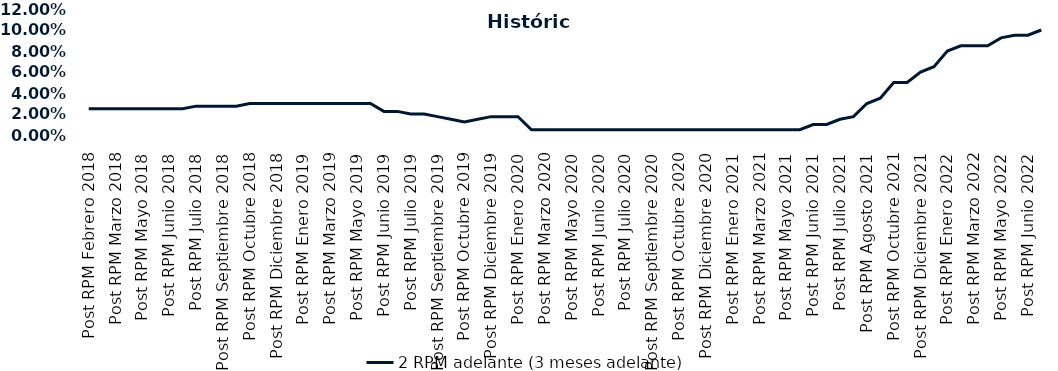
| Category | 2 RPM adelante (3 meses adelante) |
|---|---|
| Post RPM Febrero 2018 | 0.025 |
| Pre RPM Marzo 2018 | 0.025 |
| Post RPM Marzo 2018 | 0.025 |
| Pre RPM Mayo 2018 | 0.025 |
| Post RPM Mayo 2018 | 0.025 |
| Pre RPM Junio 2018 | 0.025 |
| Post RPM Junio 2018 | 0.025 |
| Pre RPM Julio 2018 | 0.025 |
| Post RPM Julio 2018 | 0.028 |
| Pre RPM Septiembre 2018 | 0.028 |
| Post RPM Septiembre 2018 | 0.028 |
| Pre RPM Octubre 2018 | 0.028 |
| Post RPM Octubre 2018 | 0.03 |
| Pre RPM Diciembre 2018 | 0.03 |
| Post RPM Diciembre 2018 | 0.03 |
| Pre RPM Enero 2019 | 0.03 |
| Post RPM Enero 2019 | 0.03 |
| Pre RPM Marzo 2019 | 0.03 |
| Post RPM Marzo 2019 | 0.03 |
| Pre RPM Mayo 2019 | 0.03 |
| Post RPM Mayo 2019 | 0.03 |
| Pre RPM Junio 2019 | 0.03 |
| Post RPM Junio 2019 | 0.022 |
| Pre RPM Julio 2019 | 0.022 |
| Post RPM Julio 2019 | 0.02 |
| Pre RPM Septiembre 2019 | 0.02 |
| Post RPM Septiembre 2019 | 0.018 |
| Pre RPM Octubre 2019 | 0.015 |
| Post RPM Octubre 2019 | 0.012 |
| Pre RPM Diciembre 2019 | 0.015 |
| Post RPM Diciembre 2019 | 0.018 |
| Pre RPM Enero 2020 | 0.018 |
| Post RPM Enero 2020 | 0.018 |
| Pre RPM Marzo 2020 | 0.005 |
| Post RPM Marzo 2020 | 0.005 |
| Pre RPM Mayo 2020 | 0.005 |
| Post RPM Mayo 2020 | 0.005 |
| Pre RPM Junio 2020 | 0.005 |
| Post RPM Junio 2020 | 0.005 |
| Pre RPM Julio 2020 | 0.005 |
| Post RPM Julio 2020 | 0.005 |
| Pre RPM Septiembre 2020 | 0.005 |
| Post RPM Septiembre 2020 | 0.005 |
| Pre RPM Octubre 2020 | 0.005 |
| Post RPM Octubre 2020 | 0.005 |
| Pre RPM Diciembre 2020 | 0.005 |
| Post RPM Diciembre 2020 | 0.005 |
| Pre RPM Enero 2021 | 0.005 |
| Post RPM Enero 2021 | 0.005 |
| Pre RPM Marzo 2021 | 0.005 |
| Post RPM Marzo 2021 | 0.005 |
| Pre RPM Mayo 2021 | 0.005 |
| Post RPM Mayo 2021 | 0.005 |
| Pre RPM Junio 2021 | 0.005 |
| Post RPM Junio 2021 | 0.01 |
| Pre RPM Julio 2021 | 0.01 |
| Post RPM Julio 2021 | 0.015 |
| Pre RPM Agosto 2021 | 0.018 |
| Post RPM Agosto 2021 | 0.03 |
| Pre RPM Octubre 2021 | 0.035 |
| Post RPM Octubre 2021 | 0.05 |
| Pre RPM Diciembre 2021 | 0.05 |
| Post RPM Diciembre 2021 | 0.06 |
| Pre RPM Enero 2022 | 0.065 |
| Post RPM Enero 2022 | 0.08 |
| Pre RPM Marzo 2022 | 0.085 |
| Post RPM Marzo 2022 | 0.085 |
| Pre RPM Mayo 2022 | 0.085 |
| Post RPM Mayo 2022 | 0.092 |
| Pre RPM Junio 2022 | 0.095 |
| Post RPM Junio 2022 | 0.095 |
| Pre RPM Julio 2022 | 0.1 |